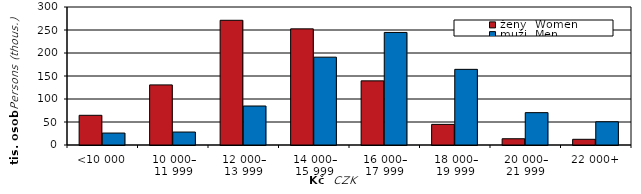
| Category | ženy  Women | muži  Men |
|---|---|---|
| <10 000 | 64549 | 25953 |
| 10 000–
11 999 | 130664 | 28191 |
| 12 000–
13 999 | 271094 | 84782 |
| 14 000–
15 999 | 252474 | 190960 |
| 16 000–
17 999 | 139426 | 244693 |
| 18 000–
19 999 | 44835 | 164464 |
| 20 000–
21 999 | 13587 | 70315 |
| 22 000+ | 12387 | 50507 |